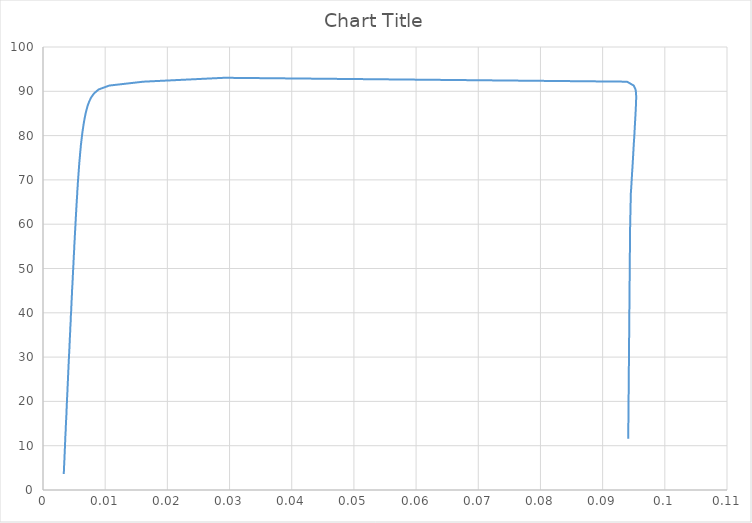
| Category | Series 0 |
|---|---|
| 0.00334192719310522 | 3.602 |
| 0.00336676277220249 | 4.5 |
| 0.0033942312002182 | 5.437 |
| 0.00342868617735803 | 6.431 |
| 0.00345944915898144 | 7.438 |
| 0.0034892710391432 | 8.465 |
| 0.00352098629809916 | 9.429 |
| 0.00354377017356455 | 10.379 |
| 0.00357739394530654 | 11.309 |
| 0.00360103417187929 | 12.272 |
| 0.00364036625251174 | 13.24 |
| 0.00366543955169618 | 14.236 |
| 0.00369749660603702 | 15.144 |
| 0.00372887589037418 | 16.064 |
| 0.00376520794816315 | 17.049 |
| 0.0037912002298981 | 18.085 |
| 0.00382434204220772 | 19.15 |
| 0.00385407125577331 | 20.156 |
| 0.00388710061088204 | 21.129 |
| 0.00392075907438993 | 22.067 |
| 0.00394606171175838 | 22.972 |
| 0.0039752977900207 | 23.869 |
| 0.00400704145431519 | 24.764 |
| 0.00403524376451969 | 25.699 |
| 0.00406282255426049 | 26.585 |
| 0.00409140810370445 | 27.479 |
| 0.00411861995235085 | 28.37 |
| 0.00414831889793277 | 29.247 |
| 0.00417912285774946 | 30.13 |
| 0.00421771919354796 | 31.157 |
| 0.00425332738086581 | 32.176 |
| 0.0042796153575182 | 33.068 |
| 0.00431116763502359 | 34.1 |
| 0.00434855138882995 | 35.117 |
| 0.00438159611076117 | 36.146 |
| 0.00440991390496492 | 37.161 |
| 0.00445932056754827 | 38.215 |
| 0.00447791395708919 | 39.246 |
| 0.00452231336385012 | 40.278 |
| 0.00455551501363516 | 41.27 |
| 0.00458465609699488 | 42.264 |
| 0.00461867917329073 | 43.279 |
| 0.00465875584632158 | 44.295 |
| 0.00468610739335418 | 45.341 |
| 0.00473018083721399 | 46.346 |
| 0.00476529821753502 | 47.333 |
| 0.00479885702952743 | 48.352 |
| 0.004833466373384 | 49.383 |
| 0.0048723379150033 | 50.369 |
| 0.00490893283858895 | 51.38 |
| 0.00494039664044976 | 52.368 |
| 0.00497531751170754 | 53.338 |
| 0.00501489453017712 | 54.306 |
| 0.00504143303260207 | 55.288 |
| 0.00508392928168178 | 56.31 |
| 0.00511736376211047 | 57.258 |
| 0.00515156332403421 | 58.187 |
| 0.00519232172518969 | 59.154 |
| 0.00522834109142423 | 60.115 |
| 0.00526335183531046 | 61.075 |
| 0.00529783312231302 | 61.995 |
| 0.00533547392114997 | 62.918 |
| 0.00537322741001844 | 63.88 |
| 0.00540929986163974 | 64.78 |
| 0.00544952927157283 | 65.693 |
| 0.0054900711402297 | 66.575 |
| 0.0055237109772861 | 67.575 |
| 0.00557657144963741 | 68.573 |
| 0.0056145885027945 | 69.539 |
| 0.00566469598561525 | 70.509 |
| 0.00571720441803336 | 71.436 |
| 0.00575897702947259 | 72.32 |
| 0.00580378016456962 | 73.203 |
| 0.00586010841652751 | 74.193 |
| 0.00592435756698251 | 75.144 |
| 0.00597535213455558 | 76.071 |
| 0.00604074448347092 | 76.981 |
| 0.00609926972538233 | 77.931 |
| 0.00617681164294481 | 78.841 |
| 0.00624969694763422 | 79.722 |
| 0.00632816692814231 | 80.613 |
| 0.00641771452501416 | 81.5 |
| 0.00651161000132561 | 82.382 |
| 0.00661702081561089 | 83.288 |
| 0.00673154694959521 | 84.167 |
| 0.00686233723536134 | 85.067 |
| 0.0070280390791595 | 85.967 |
| 0.00720637291669846 | 86.865 |
| 0.00744733586907387 | 87.746 |
| 0.00775792961940169 | 88.633 |
| 0.00820880848914385 | 89.527 |
| 0.00894153583794832 | 90.409 |
| 0.010650709271431 | 91.294 |
| 0.0161542091518641 | 92.173 |
| 0.0291533134877682 | 93.051 |
| 0.0939203798770905 | 92.172 |
| 0.0950019210577011 | 91.291 |
| 0.0952933207154274 | 90.413 |
| 0.0953771620988846 | 89.529 |
| 0.0953964069485664 | 88.644 |
| 0.0953805148601532 | 87.767 |
| 0.0953554734587669 | 86.887 |
| 0.0953276306390762 | 86.008 |
| 0.0952962785959244 | 85.129 |
| 0.0952622517943382 | 84.241 |
| 0.0952263027429581 | 83.361 |
| 0.0951913669705391 | 82.481 |
| 0.0951575115323067 | 81.598 |
| 0.0951262563467026 | 80.721 |
| 0.0950879007577896 | 79.832 |
| 0.095048688352108 | 78.946 |
| 0.0950048267841339 | 78.053 |
| 0.0949720293283463 | 77.161 |
| 0.0949373468756676 | 76.266 |
| 0.094901867210865 | 75.38 |
| 0.0948663204908371 | 74.493 |
| 0.0948294997215271 | 73.607 |
| 0.0947921276092529 | 72.719 |
| 0.094746321439743 | 71.843 |
| 0.0947130247950554 | 70.952 |
| 0.0946745425462723 | 70.06 |
| 0.0946393385529518 | 69.173 |
| 0.0945998802781105 | 68.263 |
| 0.0945340618491173 | 66.952 |
| 0.0944148078560829 | 58.939 |
| 0.094116672873497 | 11.55 |